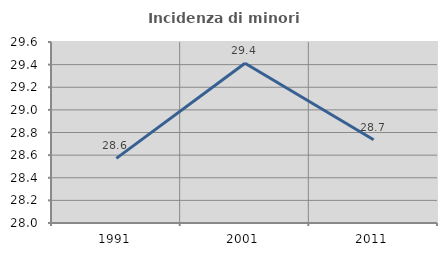
| Category | Incidenza di minori stranieri |
|---|---|
| 1991.0 | 28.571 |
| 2001.0 | 29.412 |
| 2011.0 | 28.736 |